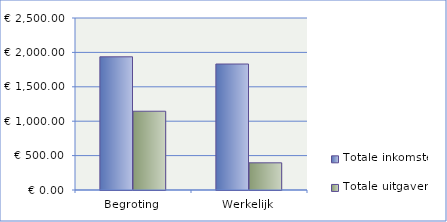
| Category | Totale inkomsten | Totale uitgaven |
|---|---|---|
| Begroting | 1936 | 1145 |
| Werkelijk | 1831 | 395 |